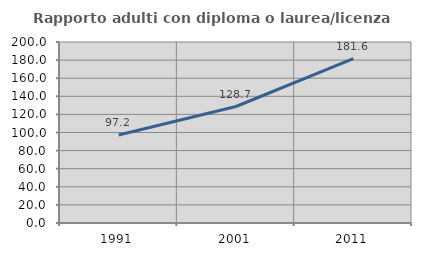
| Category | Rapporto adulti con diploma o laurea/licenza media  |
|---|---|
| 1991.0 | 97.209 |
| 2001.0 | 128.723 |
| 2011.0 | 181.597 |